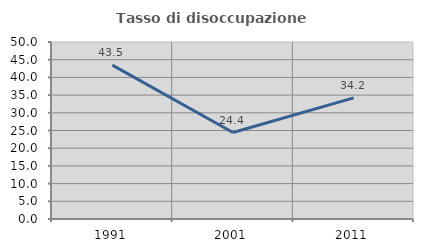
| Category | Tasso di disoccupazione giovanile  |
|---|---|
| 1991.0 | 43.478 |
| 2001.0 | 24.427 |
| 2011.0 | 34.211 |